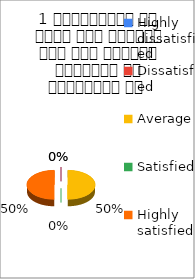
| Category | 1 व्याख्यान से रूचि में वृद्धि हुई एवं शिक्षण जानकारी से परिपूर्ण था  |
|---|---|
| Highly dissatisfied | 0 |
| Dissatisfied | 0 |
| Average | 1 |
| Satisfied | 0 |
| Highly satisfied | 1 |